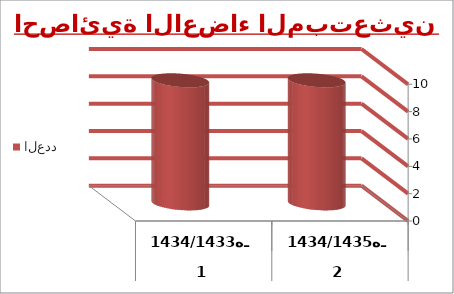
| Category | العدد |
|---|---|
| 0 | 9 |
| 1 | 9 |